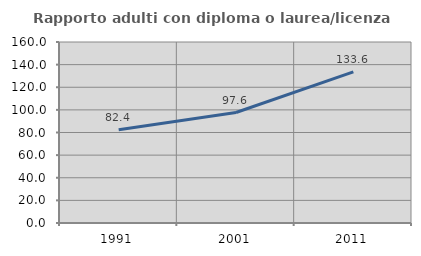
| Category | Rapporto adulti con diploma o laurea/licenza media  |
|---|---|
| 1991.0 | 82.361 |
| 2001.0 | 97.649 |
| 2011.0 | 133.611 |